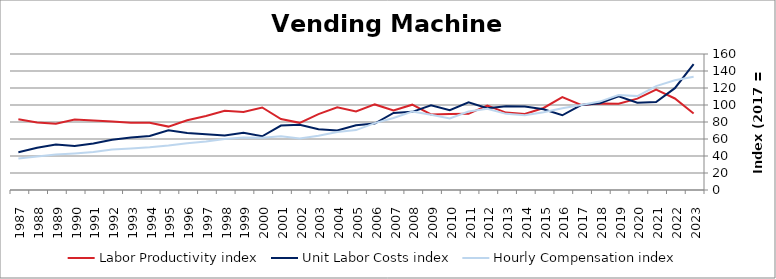
| Category | Labor Productivity index | Unit Labor Costs index | Hourly Compensation index |
|---|---|---|---|
| 2023.0 | 90.011 | 148.127 | 133.33 |
| 2022.0 | 107.679 | 119.807 | 129.008 |
| 2021.0 | 118.015 | 103.588 | 122.249 |
| 2020.0 | 107.518 | 102.729 | 110.452 |
| 2019.0 | 101.402 | 110.213 | 111.759 |
| 2018.0 | 101.785 | 102.168 | 103.992 |
| 2017.0 | 100 | 100 | 100 |
| 2016.0 | 109.37 | 87.911 | 96.148 |
| 2015.0 | 96.522 | 94.895 | 91.594 |
| 2014.0 | 89.471 | 98.256 | 87.911 |
| 2013.0 | 91.043 | 98.399 | 89.586 |
| 2012.0 | 99.458 | 96.194 | 95.672 |
| 2011.0 | 89.615 | 103.091 | 92.385 |
| 2010.0 | 89.478 | 93.931 | 84.047 |
| 2009.0 | 88.905 | 99.543 | 88.499 |
| 2008.0 | 100.36 | 91.929 | 92.26 |
| 2007.0 | 93.489 | 90.65 | 84.748 |
| 2006.0 | 100.671 | 78.156 | 78.68 |
| 2005.0 | 92.397 | 76.247 | 70.45 |
| 2004.0 | 97.364 | 70.112 | 68.263 |
| 2003.0 | 89.25 | 71.519 | 63.831 |
| 2002.0 | 79.023 | 76.855 | 60.733 |
| 2001.0 | 83.46 | 75.779 | 63.245 |
| 2000.0 | 97.097 | 63.212 | 61.377 |
| 1999.0 | 91.793 | 67.379 | 61.849 |
| 1998.0 | 93.267 | 64.233 | 59.908 |
| 1997.0 | 87.038 | 65.712 | 57.195 |
| 1996.0 | 82.064 | 67.127 | 55.088 |
| 1995.0 | 74.588 | 70.239 | 52.39 |
| 1994.0 | 78.977 | 63.591 | 50.222 |
| 1993.0 | 79.087 | 61.657 | 48.763 |
| 1992.0 | 80.626 | 59.106 | 47.655 |
| 1991.0 | 81.763 | 54.793 | 44.8 |
| 1990.0 | 82.88 | 51.859 | 42.981 |
| 1989.0 | 77.944 | 53.433 | 41.648 |
| 1988.0 | 79.295 | 49.654 | 39.373 |
| 1987.0 | 83.187 | 44.496 | 37.015 |